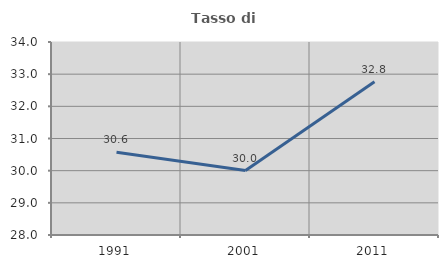
| Category | Tasso di occupazione   |
|---|---|
| 1991.0 | 30.574 |
| 2001.0 | 30.005 |
| 2011.0 | 32.762 |